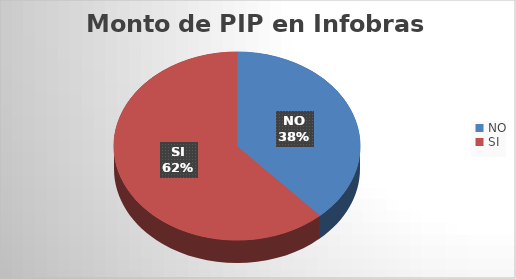
| Category | Costo Total |
|---|---|
| NO | 3311557649.78 |
| SI | 201190639.21 |